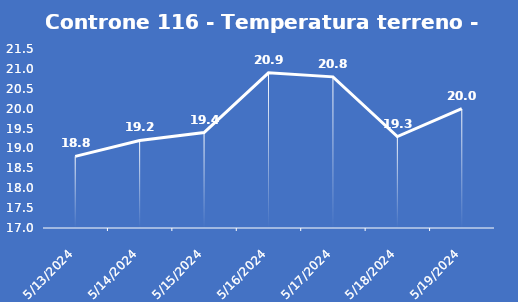
| Category | Controne 116 - Temperatura terreno - Grezzo (°C) |
|---|---|
| 5/13/24 | 18.8 |
| 5/14/24 | 19.2 |
| 5/15/24 | 19.4 |
| 5/16/24 | 20.9 |
| 5/17/24 | 20.8 |
| 5/18/24 | 19.3 |
| 5/19/24 | 20 |